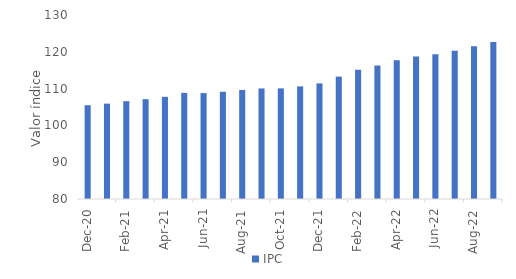
| Category | IPC |
|---|---|
| 2020-12-01 | 105.48 |
| 2021-01-01 | 105.91 |
| 2021-02-01 | 106.58 |
| 2021-03-01 | 107.12 |
| 2021-04-01 | 107.76 |
| 2021-05-01 | 108.84 |
| 2021-06-01 | 108.78 |
| 2021-07-01 | 109.14 |
| 2021-08-01 | 109.62 |
| 2021-09-01 | 110.04 |
| 2021-10-01 | 110.06 |
| 2021-11-01 | 110.6 |
| 2021-12-01 | 111.41 |
| 2022-01-01 | 113.26 |
| 2022-02-01 | 115.11 |
| 2022-03-01 | 116.26 |
| 2022-04-01 | 117.71 |
| 2022-05-01 | 118.7 |
| 2022-06-01 | 119.31 |
| 2022-07-01 | 120.27 |
| 2022-08-01 | 121.5 |
| 2022-09-01 | 122.63 |